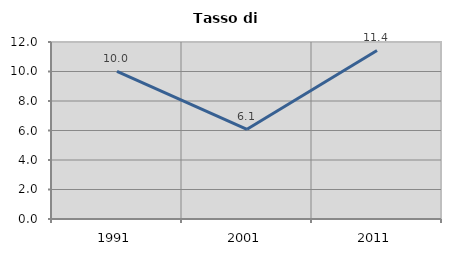
| Category | Tasso di disoccupazione   |
|---|---|
| 1991.0 | 10.01 |
| 2001.0 | 6.081 |
| 2011.0 | 11.426 |